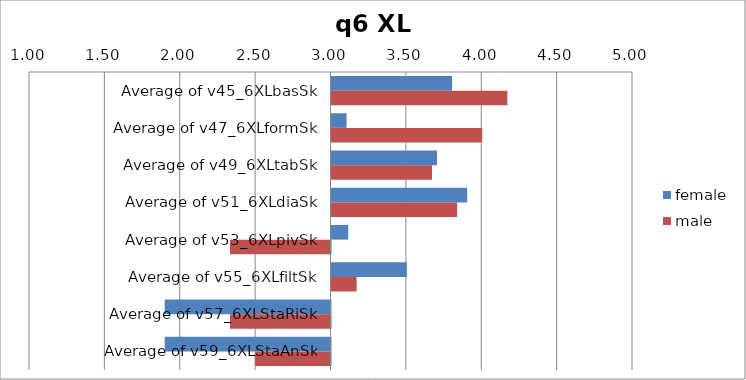
| Category | female | male |
|---|---|---|
| Average of v45_6XLbasSk | 3.8 | 4.167 |
| Average of v47_6XLformSk | 3.1 | 4 |
| Average of v49_6XLtabSk | 3.7 | 3.667 |
| Average of v51_6XLdiaSk | 3.9 | 3.833 |
| Average of v53_6XLpivSk | 3.111 | 2.333 |
| Average of v55_6XLfiltSk | 3.5 | 3.167 |
| Average of v57_6XLStaRiSk | 1.9 | 2.333 |
| Average of v59_6XLStaAnSk | 1.9 | 2.5 |